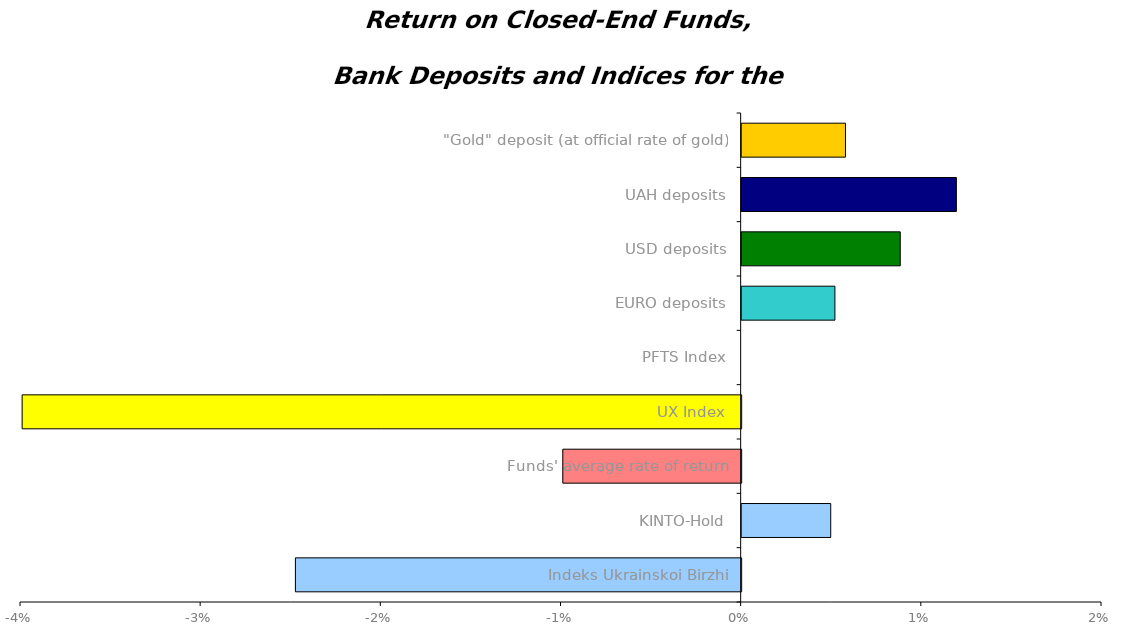
| Category | Series 0 |
|---|---|
| Іndeks Ukrainskoi Birzhi | -0.025 |
|  KINTO-Hold | 0.005 |
| Funds' average rate of return | -0.01 |
| UX Index | -0.04 |
| PFTS Index | 0 |
| EURO deposits | 0.005 |
| USD deposits | 0.009 |
| UAH deposits | 0.012 |
| "Gold" deposit (at official rate of gold) | 0.006 |